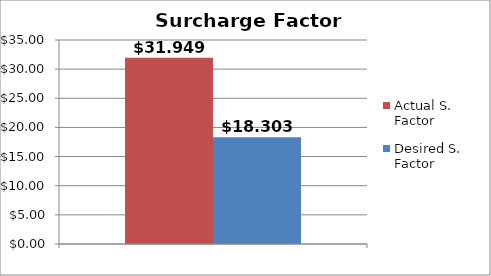
| Category | Actual S. Factor | Desired S. Factor |
|---|---|---|
| 1.0 | 31.95 | 18.304 |